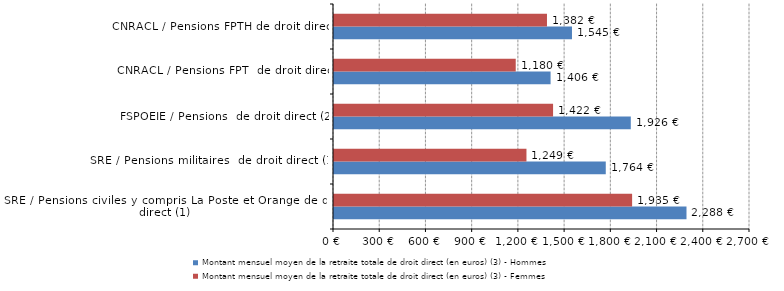
| Category | Montant mensuel moyen de la retraite totale de droit direct (en euros) (3) - Hommes | Montant mensuel moyen de la retraite totale de droit direct (en euros) (3) - Femmes |
|---|---|---|
| SRE / Pensions civiles y compris La Poste et Orange de droit direct (1) | 2287.816 | 1934.882 |
| SRE / Pensions militaires  de droit direct (1) | 1763.872 | 1249.155 |
| FSPOEIE / Pensions  de droit direct (2) | 1926.25 | 1421.89 |
| CNRACL / Pensions FPT  de droit direct | 1405.716 | 1179.531 |
| CNRACL / Pensions FPTH de droit direct | 1544.58 | 1382.304 |